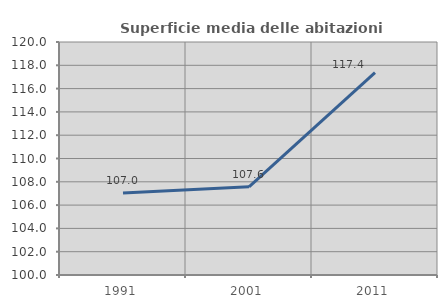
| Category | Superficie media delle abitazioni occupate |
|---|---|
| 1991.0 | 107.036 |
| 2001.0 | 107.571 |
| 2011.0 | 117.373 |